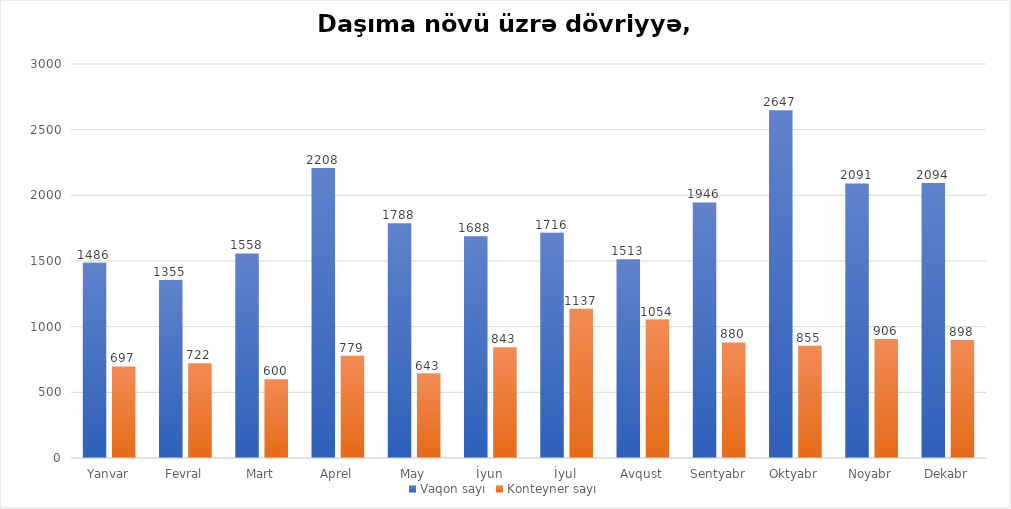
| Category | Vaqon sayı | Konteyner sayı |
|---|---|---|
| Yanvar | 1486 | 697 |
| Fevral | 1355 | 722 |
| Mart | 1558 | 600 |
| Aprel | 2208 | 779 |
| May | 1788 | 643 |
| İyun | 1688 | 843 |
| İyul | 1716 | 1137 |
| Avqust | 1513 | 1054 |
| Sentyabr | 1946 | 880 |
| Oktyabr | 2647 | 855 |
| Noyabr | 2091 | 906 |
| Dekabr | 2094 | 898 |